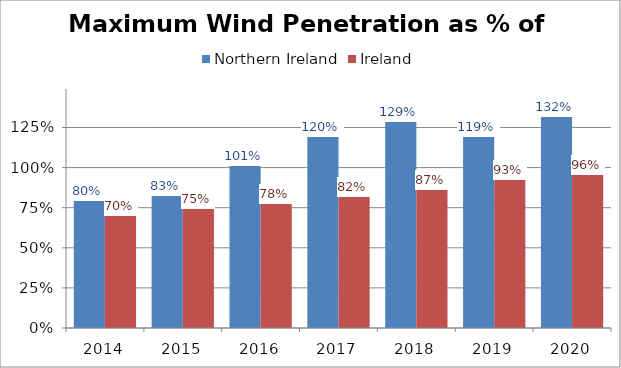
| Category | Northern Ireland | Ireland |
|---|---|---|
| 2014.0 | 0.797 | 0.705 |
| 2015.0 | 0.831 | 0.747 |
| 2016.0 | 1.014 | 0.779 |
| 2017.0 | 1.196 | 0.821 |
| 2018.0 | 1.29 | 0.865 |
| 2019.0 | 1.195 | 0.93 |
| 2020.0 | 1.324 | 0.963 |